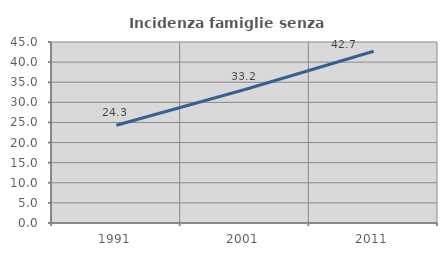
| Category | Incidenza famiglie senza nuclei |
|---|---|
| 1991.0 | 24.303 |
| 2001.0 | 33.197 |
| 2011.0 | 42.688 |